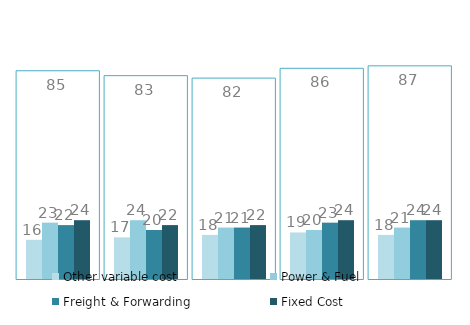
| Category | Total Cost |
|---|---|
| 2011 | 85 |
| 2012 | 83 |
| 2013 | 82 |
| 2014 | 86 |
| 2015 | 87 |